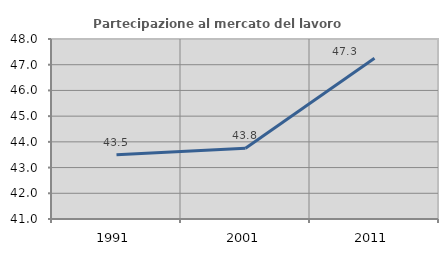
| Category | Partecipazione al mercato del lavoro  femminile |
|---|---|
| 1991.0 | 43.5 |
| 2001.0 | 43.753 |
| 2011.0 | 47.252 |